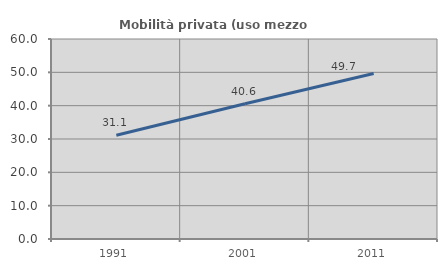
| Category | Mobilità privata (uso mezzo privato) |
|---|---|
| 1991.0 | 31.138 |
| 2001.0 | 40.587 |
| 2011.0 | 49.664 |